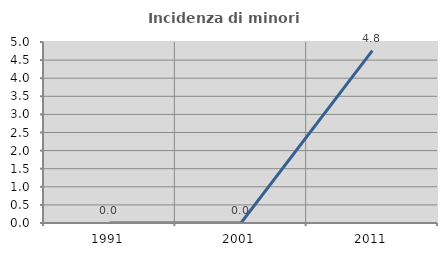
| Category | Incidenza di minori stranieri |
|---|---|
| 1991.0 | 0 |
| 2001.0 | 0 |
| 2011.0 | 4.762 |